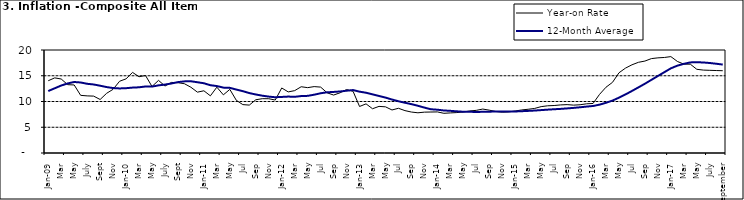
| Category | Year-on Rate | 12-Month Average |
|---|---|---|
| Jan-09 | 14.034 | 12.032 |
| Feb | 14.584 | 12.567 |
| Mar | 14.366 | 13.101 |
| Apr | 13.268 | 13.51 |
| May | 13.212 | 13.787 |
| June | 11.194 | 13.694 |
| July | 11.09 | 13.437 |
| Aug | 11.046 | 13.307 |
| Sept | 10.39 | 13.065 |
| Oct | 11.588 | 12.803 |
| Nov | 12.368 | 12.609 |
| Dec | 13.93 | 12.538 |
| Jan-10 | 14.398 | 12.586 |
| Feb | 15.649 | 12.7 |
| Mar | 14.812 | 12.757 |
| Apr | 15.044 | 12.915 |
| May | 12.915 | 12.893 |
| June | 14.099 | 13.132 |
| July | 13.002 | 13.284 |
| Aug | 13.702 | 13.5 |
| Sept | 13.65 | 13.764 |
| Oct | 13.45 | 13.908 |
| Nov | 12.766 | 13.928 |
| Dec | 11.815 | 13.74 |
| Jan-11 | 12.08 | 13.542 |
| Feb | 11.1 | 13.161 |
| Mar | 12.779 | 13.001 |
| Apr | 11.291 | 12.694 |
| May | 12.352 | 12.648 |
| Jun | 10.23 | 12.321 |
| Jul | 9.397 | 12.009 |
| Aug | 9.301 | 11.635 |
| Sep | 10.339 | 11.363 |
| Oct | 10.544 | 11.13 |
| Nov | 10.54 | 10.952 |
| Dec | 10.283 | 10.826 |
| Jan-12 | 12.626 | 10.886 |
| Feb | 11.866 | 10.955 |
| Mar | 12.111 | 10.914 |
| Apr | 12.866 | 11.054 |
| May | 12.688 | 11.096 |
| Jun | 12.892 | 11.32 |
| Jul | 12.797 | 11.599 |
| Aug | 11.689 | 11.791 |
| Sep | 11.253 | 11.859 |
| Oct | 11.693 | 11.948 |
| Nov | 12.32 | 12.091 |
| Dec | 11.981 | 12.224 |
| Jan-13 | 9.031 | 11.908 |
| Feb | 9.542 | 11.703 |
| Mar | 8.593 | 11.394 |
| Apr | 9.052 | 11.072 |
| May | 8.964 | 10.761 |
| Jun | 8.353 | 10.383 |
| Jul | 8.682 | 10.047 |
| Aug | 8.231 | 9.761 |
| Sep | 7.952 | 9.486 |
| Oct | 7.807 | 9.167 |
| Nov | 7.931 | 8.815 |
| Dec | 7.957 | 8.496 |
| Jan-14 | 7.977 | 8.408 |
| Feb | 7.707 | 8.257 |
| Mar | 7.783 | 8.19 |
| Apr | 7.851 | 8.092 |
| May | 7.965 | 8.012 |
| Jun | 8.167 | 7.998 |
| Jul | 8.281 | 7.968 |
| Aug | 8.534 | 7.996 |
| Sep | 8.317 | 8.027 |
| Oct | 8.06 | 8.047 |
| Nov | 7.927 | 8.046 |
| Dec | 7.978 | 8.047 |
| Jan-15 | 8.157 | 8.063 |
| Feb | 8.359 | 8.117 |
| Mar | 8.494 | 8.176 |
| Apr | 8.655 | 8.243 |
| May | 9.003 | 8.331 |
| Jun | 9.168 | 8.417 |
| Jul | 9.218 | 8.497 |
| Aug | 9.336 | 8.566 |
| Sep | 9.394 | 8.658 |
| Oct | 9.296 | 8.76 |
| Nov | 9.368 | 8.879 |
| Dec | 9.554 | 9.009 |
| Jan-16 | 9.617 | 9.13 |
| Feb | 11.379 | 9.386 |
| Mar | 12.775 | 9.751 |
| Apr | 13.721 | 10.182 |
| May | 15.577 | 10.746 |
| Jun | 16.48 | 11.372 |
| Jul | 17.127 | 12.045 |
| Aug | 17.609 | 12.744 |
| Sep | 17.852 | 13.454 |
| Oct | 18.33 | 14.206 |
| Nov | 18.476 | 14.958 |
| Dec | 18.547 | 15.697 |
| Jan-17 | 18.719 | 16.441 |
| Feb | 17.78 | 16.958 |
| Mar | 17.256 | 17.315 |
| Apr | 17.244 | 17.591 |
| May | 16.251 | 17.628 |
| June | 16.098 | 17.578 |
| July | 16.053 | 17.475 |
| August | 16.012 | 17.331 |
| September | 15.979 | 17.17 |